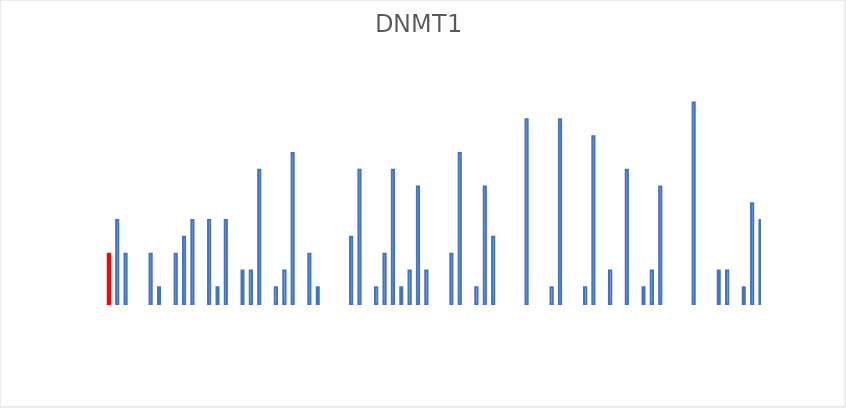
| Category | DNMT1 |
|---|---|
| 0 | 0 |
| 1 | 3 |
| 2 | 5 |
| 3 | 3 |
| 4 | 0 |
| 5 | 0 |
| 6 | 3 |
| 7 | 1 |
| 8 | 0 |
| 9 | 3 |
| 10 | 4 |
| 11 | 5 |
| 12 | 0 |
| 13 | 5 |
| 14 | 1 |
| 15 | 5 |
| 16 | 0 |
| 17 | 2 |
| 18 | 2 |
| 19 | 8 |
| 20 | 0 |
| 21 | 1 |
| 22 | 2 |
| 23 | 9 |
| 24 | 0 |
| 25 | 3 |
| 26 | 1 |
| 27 | 0 |
| 28 | 0 |
| 29 | 0 |
| 30 | 4 |
| 31 | 8 |
| 32 | 0 |
| 33 | 1 |
| 34 | 3 |
| 35 | 8 |
| 36 | 1 |
| 37 | 2 |
| 38 | 7 |
| 39 | 2 |
| 40 | 0 |
| 41 | 0 |
| 42 | 3 |
| 43 | 9 |
| 44 | 0 |
| 45 | 1 |
| 46 | 7 |
| 47 | 4 |
| 48 | 0 |
| 49 | 0 |
| 50 | 0 |
| 51 | 11 |
| 52 | 0 |
| 53 | 0 |
| 54 | 1 |
| 55 | 11 |
| 56 | 0 |
| 57 | 0 |
| 58 | 1 |
| 59 | 10 |
| 60 | 0 |
| 61 | 2 |
| 62 | 0 |
| 63 | 8 |
| 64 | 0 |
| 65 | 1 |
| 66 | 2 |
| 67 | 7 |
| 68 | 0 |
| 69 | 0 |
| 70 | 0 |
| 71 | 12 |
| 72 | 0 |
| 73 | 0 |
| 74 | 2 |
| 75 | 2 |
| 76 | 0 |
| 77 | 1 |
| 78 | 6 |
| 79 | 5 |